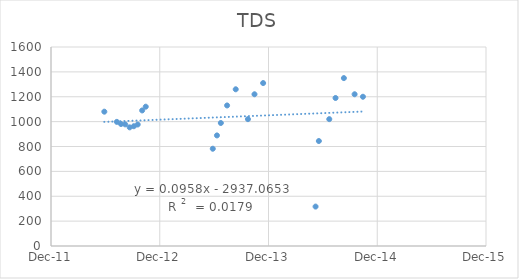
| Category | Series 0 |
|---|---|
| 41059.0 | 1080 |
| 41101.0 | 998 |
| 41115.0 | 981 |
| 41129.0 | 978 |
| 41144.0 | 954 |
| 41158.0 | 963 |
| 41171.0 | 977 |
| 41186.0 | 1090 |
| 41198.0 | 1120 |
| 41423.0 | 782 |
| 41437.0 | 889 |
| 41450.0 | 989 |
| 41471.0 | 1130 |
| 41500.0 | 1260 |
| 41541.0 | 1020 |
| 41563.0 | 1220 |
| 41592.0 | 1310 |
| 41768.0 | 317 |
| 41779.0 | 844 |
| 41814.0 | 1020 |
| 41835.0 | 1190 |
| 41863.0 | 1350 |
| 41899.0 | 1220 |
| 41927.0 | 1200 |